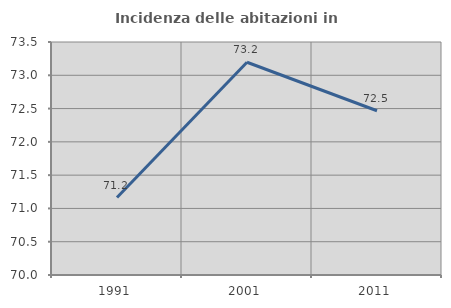
| Category | Incidenza delle abitazioni in proprietà  |
|---|---|
| 1991.0 | 71.163 |
| 2001.0 | 73.196 |
| 2011.0 | 72.467 |